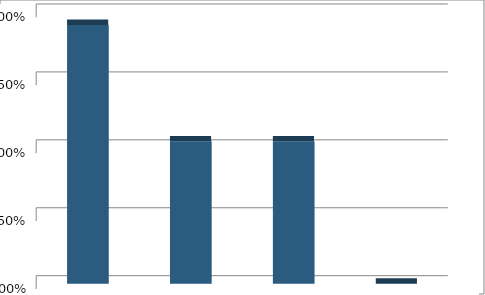
| Category | Series1 |
|---|---|
| Alternative Future #1: Low Intensity | 0.476 |
| Alternative Future #2: Medium Intensity | 0.262 |
| Alternative Future #3: High Intensity | 0.262 |
| None of the Above | 0 |